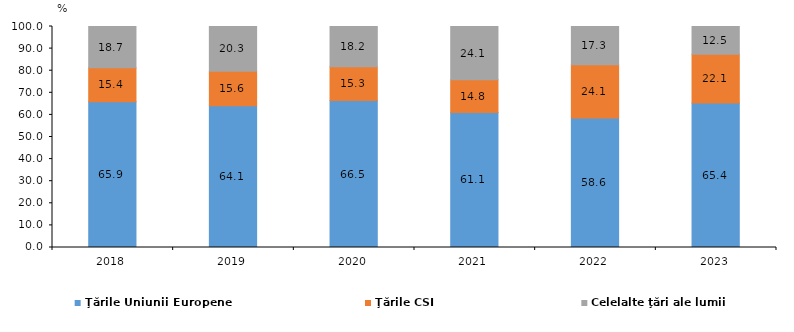
| Category | Ţările Uniunii Europene  | Ţările CSI  | Celelalte ţări ale lumii  |
|---|---|---|---|
| 2018.0 | 65.9 | 15.4 | 18.7 |
| 2019.0 | 64.1 | 15.6 | 20.3 |
| 2020.0 | 66.5 | 15.3 | 18.2 |
| 2021.0 | 61.1 | 14.8 | 24.1 |
| 2022.0 | 58.6 | 24.1 | 17.3 |
| 2023.0 | 65.4 | 22.1 | 12.5 |